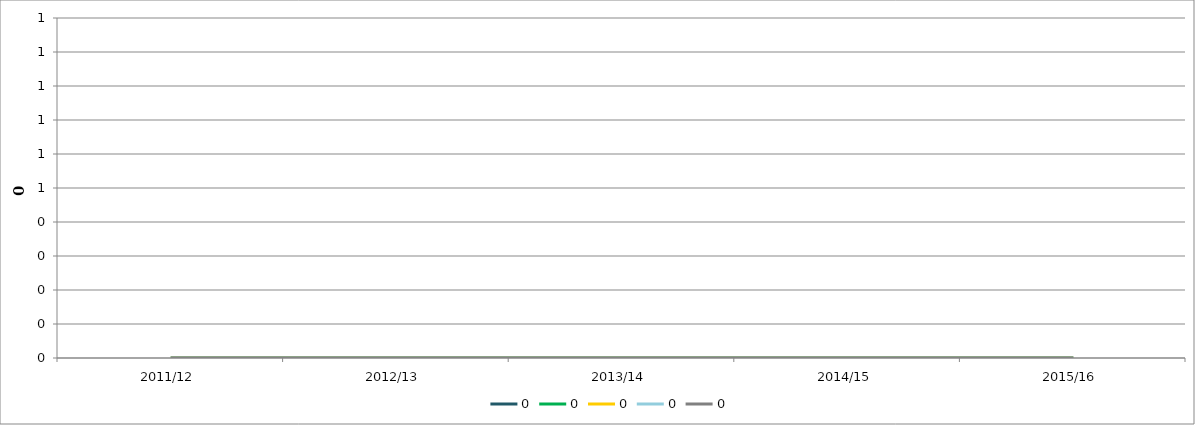
| Category | 0 |
|---|---|
| 2011/12 | 0 |
| 2012/13 | 0 |
| 2013/14 | 0 |
| 2014/15 | 0 |
| 2015/16 | 0 |